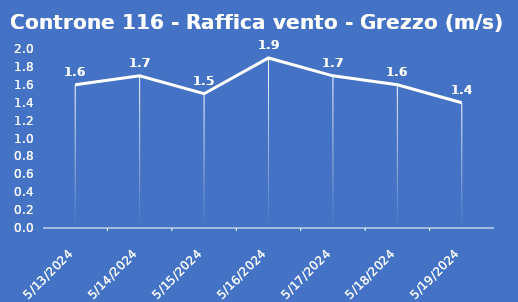
| Category | Controne 116 - Raffica vento - Grezzo (m/s) |
|---|---|
| 5/13/24 | 1.6 |
| 5/14/24 | 1.7 |
| 5/15/24 | 1.5 |
| 5/16/24 | 1.9 |
| 5/17/24 | 1.7 |
| 5/18/24 | 1.6 |
| 5/19/24 | 1.4 |